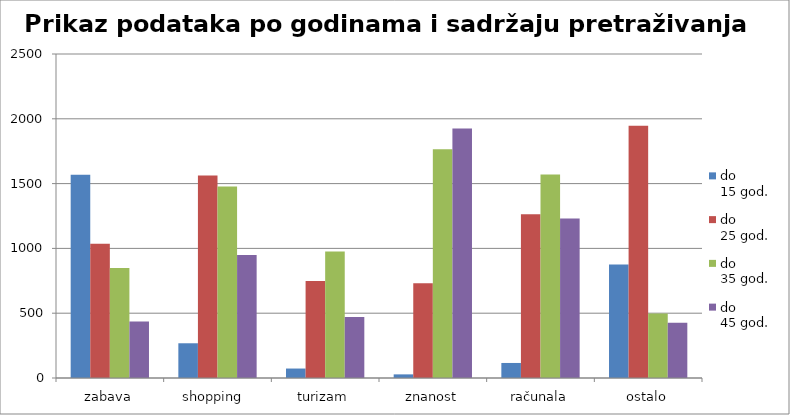
| Category | do 
15 god. | do 
25 god. | do 
35 god. | do 
45 god. |
|---|---|---|---|---|
| zabava | 1568 | 1036 | 849 | 436 |
| shopping  | 268 | 1563 | 1478 | 949 |
| turizam | 73 | 749 | 976 | 471 |
| znanost | 28 | 732 | 1765 | 1926 |
| računala | 116 | 1263 | 1571 | 1231 |
| ostalo | 876 | 1946 | 497 | 426 |